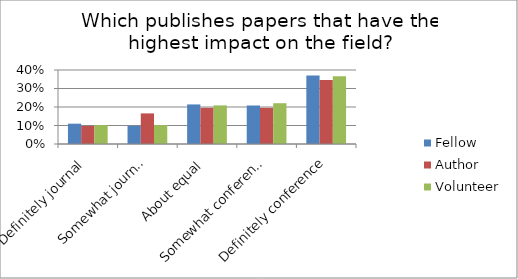
| Category | Fellow | Author | Volunteer |
|---|---|---|---|
| Definitely journal | 0.11 | 0.098 | 0.102 |
| Somewhat journal | 0.098 | 0.165 | 0.102 |
| About equal | 0.214 | 0.195 | 0.209 |
| Somewhat conference | 0.208 | 0.195 | 0.22 |
| Definitely conference | 0.37 | 0.346 | 0.366 |